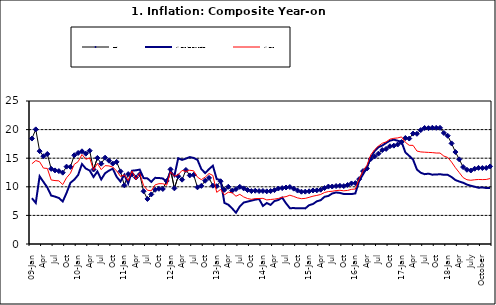
| Category | Food | All Items less Farm Produce | All Items |
|---|---|---|---|
| 09-Jan | 18.436 | 8.013 | 14.034 |
| Feb | 20.041 | 7.178 | 14.584 |
| Mar | 16.233 | 11.842 | 14.366 |
| Apr | 15.342 | 10.85 | 13.268 |
| May | 15.74 | 9.88 | 13.212 |
| June | 13.138 | 8.472 | 11.194 |
| Jul | 12.867 | 8.285 | 11.09 |
| Aug | 12.746 | 8.044 | 11.046 |
| Sep | 12.472 | 7.431 | 10.39 |
| Oct | 13.524 | 8.933 | 11.588 |
| Nov | 13.482 | 10.702 | 12.368 |
| Dec | 15.518 | 11.249 | 13.93 |
| 10-Jan | 15.918 | 12.063 | 14.398 |
| Feb | 16.208 | 13.978 | 15.649 |
| Mar | 15.79 | 13.184 | 14.812 |
| Apr | 16.306 | 12.844 | 15.044 |
| May | 13.023 | 11.711 | 12.915 |
| Jun | 15.053 | 12.686 | 14.099 |
| Jul | 14.043 | 11.287 | 13.002 |
| Aug | 15.09 | 12.366 | 13.702 |
| Sep | 14.57 | 12.83 | 13.65 |
| Oct | 14.065 | 13.168 | 13.45 |
| Nov | 14.351 | 11.746 | 12.766 |
| Dec | 12.701 | 10.917 | 11.815 |
| 11-Jan | 10.255 | 12.118 | 12.08 |
| Feb | 12.221 | 10.569 | 11.1 |
| Mar | 12.169 | 12.815 | 12.779 |
| Apr | 11.629 | 12.882 | 11.291 |
| May | 12.179 | 13.006 | 12.352 |
| Jun | 9.22 | 11.524 | 10.23 |
| Jul | 7.877 | 11.472 | 9.397 |
| Aug | 8.665 | 10.863 | 9.301 |
| Sep | 9.479 | 11.567 | 10.339 |
| Oct | 9.656 | 11.539 | 10.544 |
| Nov | 9.623 | 11.459 | 10.54 |
| Dec | 11.02 | 10.822 | 10.283 |
| 12-Jan | 13.053 | 12.748 | 12.626 |
| 12-Feb | 9.729 | 11.901 | 11.866 |
| 12-Mar | 11.848 | 14.995 | 12.111 |
| Apr | 11.246 | 14.703 | 12.866 |
| May | 12.942 | 14.926 | 12.688 |
| Jun | 11.991 | 15.199 | 12.892 |
| Jul | 12.093 | 15.045 | 12.797 |
| Aug | 9.91 | 14.714 | 11.689 |
| Sep | 10.164 | 13.101 | 11.253 |
| Oct | 11.064 | 12.398 | 11.693 |
| Nov | 11.553 | 13.092 | 12.32 |
| Dec | 10.199 | 13.685 | 11.981 |
| 13-Jan | 10.106 | 11.342 | 9.031 |
| Feb | 10.973 | 11.184 | 9.542 |
| Mar | 9.482 | 7.179 | 8.593 |
| Apr | 10.006 | 6.874 | 9.052 |
| May | 9.321 | 6.227 | 8.964 |
| Jun | 9.606 | 5.472 | 8.353 |
| Jul | 9.994 | 6.58 | 8.682 |
| Aug | 9.723 | 7.245 | 8.231 |
| Sep | 9.437 | 7.41 | 7.952 |
| Oct | 9.249 | 7.579 | 7.807 |
| Nov | 9.313 | 7.75 | 7.931 |
| Dec | 9.253 | 7.872 | 7.957 |
| 14-Jan | 9.271 | 6.648 | 7.977 |
| Feb | 9.207 | 7.166 | 7.707 |
| Mar | 9.254 | 6.836 | 7.783 |
| Apr | 9.414 | 7.508 | 7.851 |
| May | 9.698 | 7.693 | 7.965 |
| Jun | 9.776 | 8.122 | 8.167 |
| Jul | 9.878 | 7.116 | 8.281 |
| Aug | 9.959 | 6.264 | 8.534 |
| Sep | 9.676 | 6.278 | 8.317 |
| Oct | 9.343 | 6.252 | 8.06 |
| Nov | 9.144 | 6.255 | 7.927 |
| Dec | 9.152 | 6.225 | 7.978 |
| 15-Jan | 9.215 | 6.787 | 8.157 |
| Feb | 9.359 | 6.994 | 8.359 |
| Mar | 9.376 | 7.46 | 8.494 |
| Apr | 9.49 | 7.661 | 8.655 |
| May | 9.782 | 8.253 | 9.003 |
| Jun | 10.041 | 8.403 | 9.168 |
| Jul | 10.049 | 8.83 | 9.218 |
| Aug | 10.131 | 9.01 | 9.336 |
| Sep | 10.174 | 8.928 | 9.394 |
| Oct | 10.129 | 8.742 | 9.296 |
| Nov | 10.321 | 8.732 | 9.368 |
| Dec | 10.588 | 8.727 | 9.554 |
| 16-Jan | 10.642 | 8.841 | 9.617 |
| Feb | 11.348 | 11.041 | 11.379 |
| Mar | 12.745 | 12.17 | 12.775 |
| Apr | 13.194 | 13.352 | 13.721 |
| May | 14.861 | 15.054 | 15.577 |
| Jun | 15.302 | 16.224 | 16.48 |
| Jul | 15.799 | 16.929 | 17.127 |
| Aug | 16.427 | 17.208 | 17.609 |
| Sep | 16.622 | 17.666 | 17.852 |
| Oct | 17.09 | 18.067 | 18.33 |
| Nov | 17.191 | 18.241 | 18.476 |
| Dec | 17.388 | 18.052 | 18.547 |
| 17-Jan | 17.818 | 17.867 | 18.719 |
| Feb | 18.528 | 16.011 | 17.78 |
| Mar | 18.436 | 15.404 | 17.256 |
| Apr | 19.303 | 14.75 | 17.244 |
| May | 19.266 | 13.016 | 16.251 |
| Jun | 19.915 | 12.455 | 16.098 |
| Jul | 20.284 | 12.207 | 16.053 |
| Aug | 20.251 | 12.296 | 16.012 |
| Sep | 20.321 | 12.123 | 15.979 |
| Oct | 20.306 | 12.142 | 15.905 |
| Nov | 20.308 | 12.206 | 15.901 |
| Dec | 19.415 | 12.089 | 15.372 |
| 18-Jan | 18.919 | 12.09 | 15.127 |
| Feb | 17.588 | 11.707 | 14.33 |
| Mar | 16.08 | 11.181 | 13.337 |
| Apr | 14.799 | 10.92 | 12.482 |
| May | 13.448 | 10.71 | 11.608 |
| June | 12.977 | 10.387 | 11.231 |
| July | 12.85 | 10.183 | 11.142 |
| August | 13.158 | 10.015 | 11.227 |
| September | 13.309 | 9.838 | 11.284 |
| October | 13.277 | 9.882 | 11.259 |
| November | 13.301 | 9.787 | 11.281 |
| December | 13.559 | 9.771 | 11.442 |